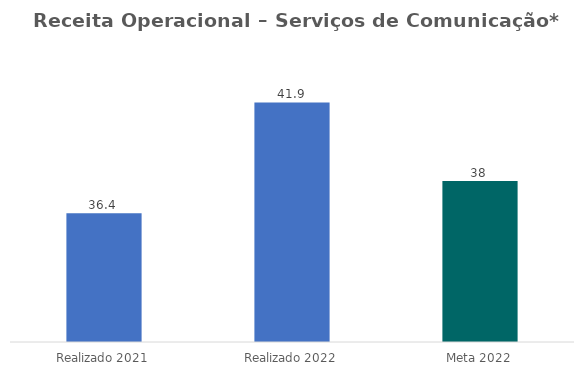
| Category | Series 0 |
|---|---|
| Realizado 2021 | 36.4 |
| Realizado 2022 | 41.9 |
| Meta 2022 | 38 |